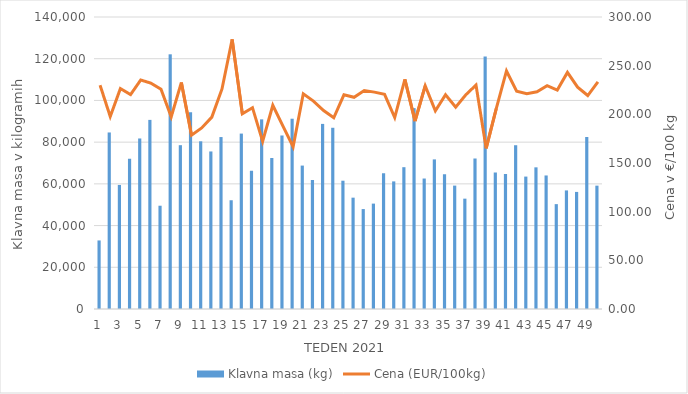
| Category | Klavna masa (kg) |
|---|---|
| 1.0 | 32871 |
| 2.0 | 84639 |
| 3.0 | 59476 |
| 4.0 | 72013 |
| 5.0 | 81759 |
| 6.0 | 90669 |
| 7.0 | 49517 |
| 8.0 | 122111 |
| 9.0 | 78545 |
| 10.0 | 94384 |
| 11.0 | 80405 |
| 12.0 | 75534 |
| 13.0 | 82440 |
| 14.0 | 52143 |
| 15.0 | 84105 |
| 16.0 | 66298 |
| 17.0 | 90925 |
| 18.0 | 72394 |
| 19.0 | 83193 |
| 20.0 | 91231 |
| 21.0 | 68763 |
| 22.0 | 61837 |
| 23.0 | 88747 |
| 24.0 | 86888 |
| 25.0 | 61507 |
| 26.0 | 53379 |
| 27.0 | 47910 |
| 28.0 | 50529 |
| 29.0 | 65062 |
| 30.0 | 61178 |
| 31.0 | 67992 |
| 32.0 | 96308 |
| 33.0 | 62558 |
| 34.0 | 71729 |
| 35.0 | 64596 |
| 36.0 | 59160 |
| 37.0 | 52905 |
| 38.0 | 72159 |
| 39.0 | 121060 |
| 40.0 | 65445 |
| 41.0 | 64780 |
| 42.0 | 78522 |
| 43.0 | 63486 |
| 44.0 | 67920 |
| 45.0 | 64023 |
| 46.0 | 50280 |
| 47.0 | 56852 |
| 48.0 | 56136 |
| 49.0 | 82462 |
| 50.0 | 59140 |